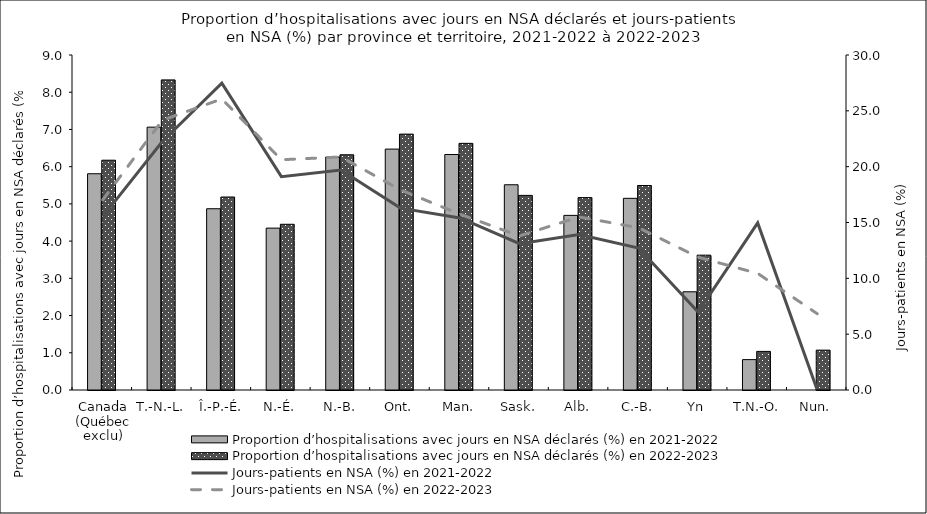
| Category | Proportion d’hospitalisations avec jours en NSA déclarés (%) en 2021-2022 | Proportion d’hospitalisations avec jours en NSA déclarés (%) en 2022-2023 |
|---|---|---|
| Canada (Québec exclu) | 5.81 | 6.174 |
| T.-N.-L. | 7.062 | 8.331 |
| Î.-P.-É. | 4.87 | 5.185 |
| N.-É. | 4.349 | 4.452 |
| N.-B. | 6.258 | 6.319 |
| Ont. | 6.472 | 6.874 |
| Man. | 6.326 | 6.626 |
| Sask. | 5.514 | 5.228 |
| Alb. | 4.691 | 5.169 |
| C.-B. | 5.149 | 5.494 |
| Yn | 2.638 | 3.623 |
| T.N.-O. | 0.816 | 1.037 |
| Nun. | 0 | 1.071 |